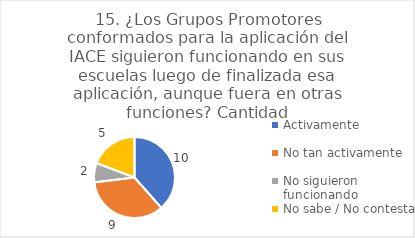
| Category | 15. ¿Los Grupos Promotores conformados para la aplicación del IACE siguieron funcionando en sus escuelas luego de finalizada esa aplicación, aunque fuera en otras funciones? |
|---|---|
| Activamente  | 0.385 |
| No tan activamente  | 0.346 |
| No siguieron funcionando  | 0.077 |
| No sabe / No contesta | 0.192 |